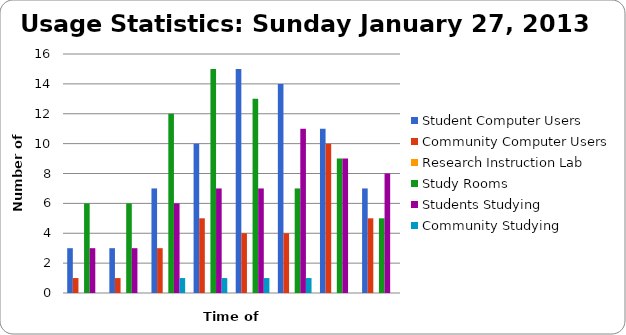
| Category | Student Computer Users | Community Computer Users | Research Instruction Lab | Study Rooms | Students Studying | Community Studying |
|---|---|---|---|---|---|---|
| 10 am | 3 | 1 | 0 | 6 | 3 | 0 |
| 11 am | 3 | 1 | 0 | 6 | 3 | 0 |
| 12 pm | 7 | 3 | 0 | 12 | 6 | 1 |
| 1 pm | 10 | 5 | 0 | 15 | 7 | 1 |
| 2 pm | 15 | 4 | 0 | 13 | 7 | 1 |
| 3 pm | 14 | 4 | 0 | 7 | 11 | 1 |
| 4 pm | 11 | 10 | 0 | 9 | 9 | 0 |
| 5 pm | 7 | 5 | 0 | 5 | 8 | 0 |